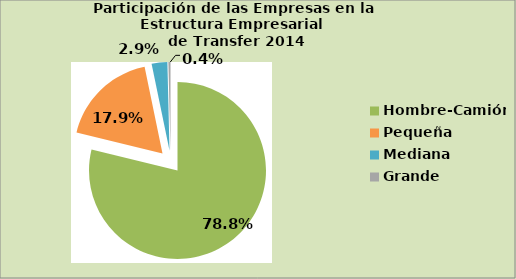
| Category | Series 0 |
|---|---|
| Hombre-Camión | 78.81 |
| Pequeña | 17.945 |
| Mediana | 2.864 |
| Grande | 0.382 |